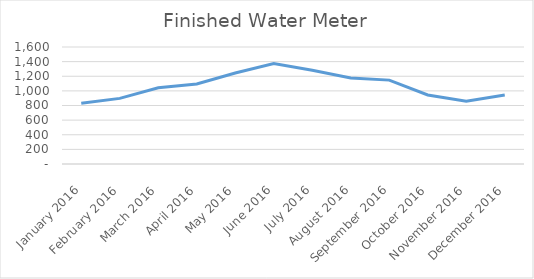
| Category | Series 0 |
|---|---|
| 2016-01-01 | 830.859 |
| 2016-02-01 | 897.135 |
| 2016-03-01 | 1043.538 |
| 2016-04-01 | 1093.556 |
| 2016-05-01 | 1244.372 |
| 2016-06-01 | 1373.169 |
| 2016-07-01 | 1280.913 |
| 2016-08-01 | 1175.144 |
| 2016-09-01 | 1147.208 |
| 2016-10-01 | 943.5 |
| 2016-11-01 | 858.34 |
| 2016-12-01 | 943.222 |